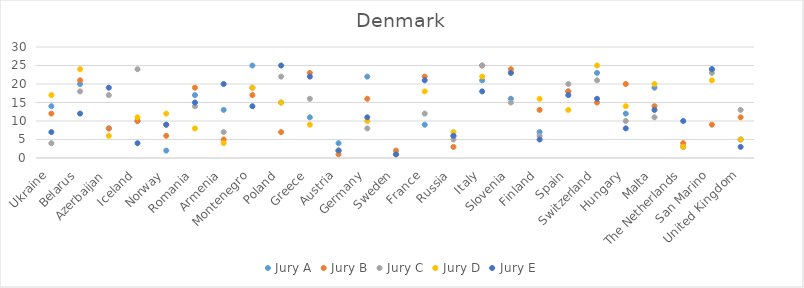
| Category | Jury A | Jury B | Jury C | Jury D | Jury E |
|---|---|---|---|---|---|
| Ukraine | 14 | 12 | 4 | 17 | 7 |
| Belarus | 20 | 21 | 18 | 24 | 12 |
| Azerbaijan | 8 | 8 | 17 | 6 | 19 |
| Iceland | 10 | 10 | 24 | 11 | 4 |
| Norway | 2 | 6 | 9 | 12 | 9 |
| Romania | 17 | 19 | 14 | 8 | 15 |
| Armenia | 13 | 5 | 7 | 4 | 20 |
| Montenegro | 25 | 17 | 19 | 19 | 14 |
| Poland | 15 | 7 | 22 | 15 | 25 |
| Greece | 11 | 23 | 16 | 9 | 22 |
| Austria | 4 | 1 | 2 | 2 | 2 |
| Germany | 22 | 16 | 8 | 10 | 11 |
| Sweden | 1 | 2 | 1 | 1 | 1 |
| France | 9 | 22 | 12 | 18 | 21 |
| Russia | 6 | 3 | 5 | 7 | 6 |
| Italy | 21 | 25 | 25 | 22 | 18 |
| Slovenia | 16 | 24 | 15 | 23 | 23 |
| Finland | 7 | 13 | 6 | 16 | 5 |
| Spain | 18 | 18 | 20 | 13 | 17 |
| Switzerland | 23 | 15 | 21 | 25 | 16 |
| Hungary | 12 | 20 | 10 | 14 | 8 |
| Malta | 19 | 14 | 11 | 20 | 13 |
| The Netherlands | 3 | 4 | 3 | 3 | 10 |
| San Marino | 24 | 9 | 23 | 21 | 24 |
| United Kingdom | 5 | 11 | 13 | 5 | 3 |